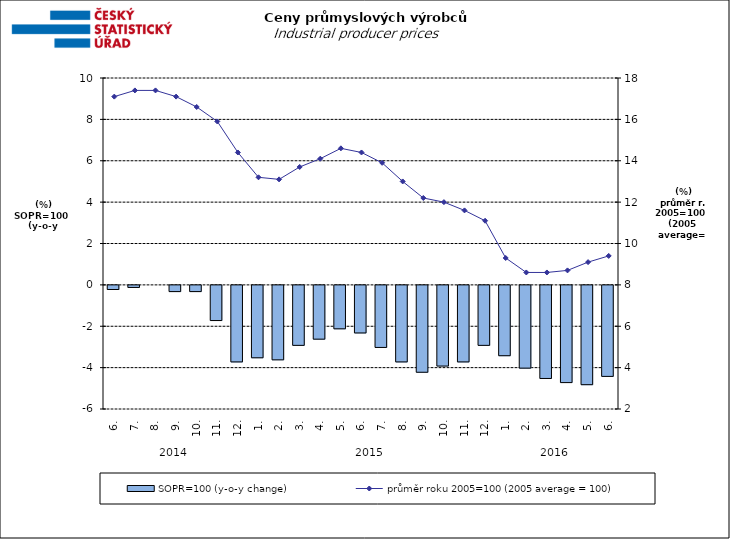
| Category | SOPR=100 (y-o-y change)   |
|---|---|
| 0 | -0.2 |
| 1 | -0.1 |
| 2 | 0 |
| 3 | -0.3 |
| 4 | -0.3 |
| 5 | -1.7 |
| 6 | -3.7 |
| 7 | -3.5 |
| 8 | -3.6 |
| 9 | -2.9 |
| 10 | -2.6 |
| 11 | -2.1 |
| 12 | -2.3 |
| 13 | -3 |
| 14 | -3.7 |
| 15 | -4.2 |
| 16 | -3.9 |
| 17 | -3.7 |
| 18 | -2.9 |
| 19 | -3.4 |
| 20 | -4 |
| 21 | -4.5 |
| 22 | -4.7 |
| 23 | -4.8 |
| 24 | -4.4 |